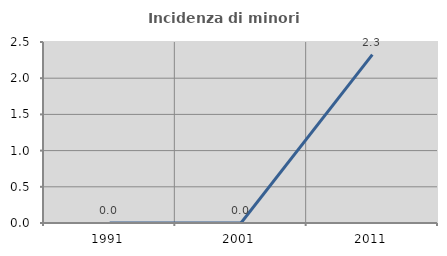
| Category | Incidenza di minori stranieri |
|---|---|
| 1991.0 | 0 |
| 2001.0 | 0 |
| 2011.0 | 2.326 |